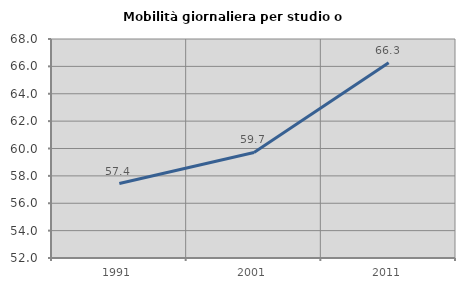
| Category | Mobilità giornaliera per studio o lavoro |
|---|---|
| 1991.0 | 57.438 |
| 2001.0 | 59.712 |
| 2011.0 | 66.262 |